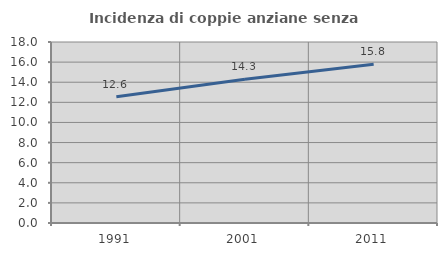
| Category | Incidenza di coppie anziane senza figli  |
|---|---|
| 1991.0 | 12.551 |
| 2001.0 | 14.286 |
| 2011.0 | 15.78 |